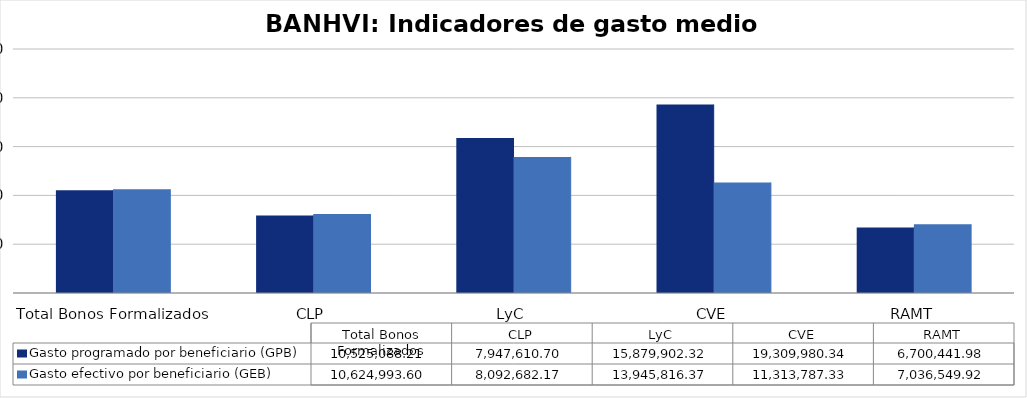
| Category | Gasto programado por beneficiario (GPB)  | Gasto efectivo por beneficiario (GEB)  |
|---|---|---|
| Total Bonos Formalizados | 10525088.212 | 10624993.603 |
| CLP | 7947610.701 | 8092682.174 |
| LyC | 15879902.324 | 13945816.365 |
| CVE | 19309980.344 | 11313787.335 |
| RAMT | 6700441.984 | 7036549.923 |